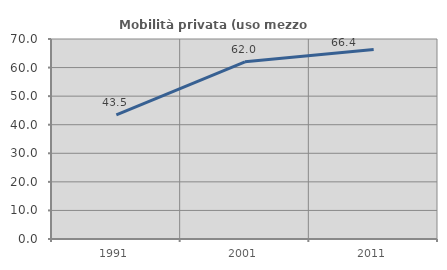
| Category | Mobilità privata (uso mezzo privato) |
|---|---|
| 1991.0 | 43.462 |
| 2001.0 | 62.017 |
| 2011.0 | 66.353 |